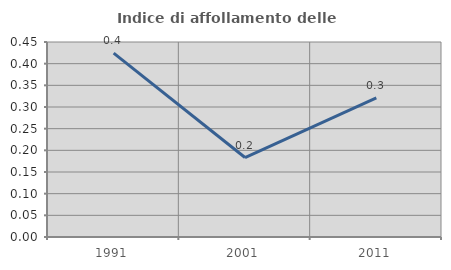
| Category | Indice di affollamento delle abitazioni  |
|---|---|
| 1991.0 | 0.424 |
| 2001.0 | 0.183 |
| 2011.0 | 0.321 |